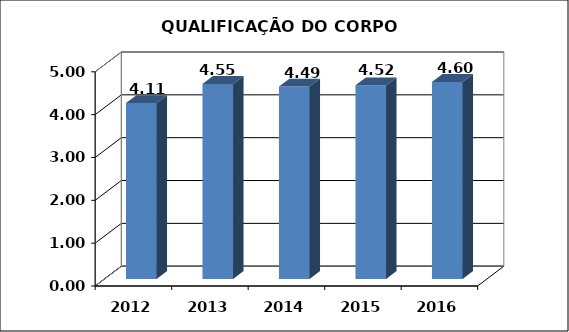
| Category | Series 0 |
|---|---|
| 2012.0 | 4.106 |
| 2013.0 | 4.553 |
| 2014.0 | 4.49 |
| 2015.0 | 4.52 |
| 2016.0 | 4.599 |